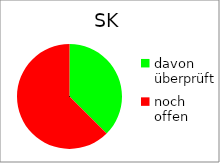
| Category | SK |
|---|---|
| davon überprüft | 3 |
| noch offen | 5 |